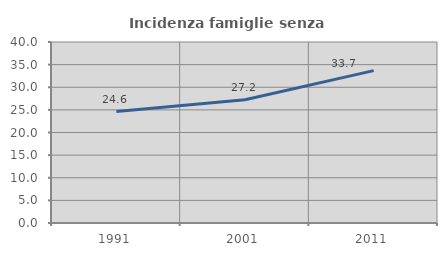
| Category | Incidenza famiglie senza nuclei |
|---|---|
| 1991.0 | 24.631 |
| 2001.0 | 27.219 |
| 2011.0 | 33.667 |